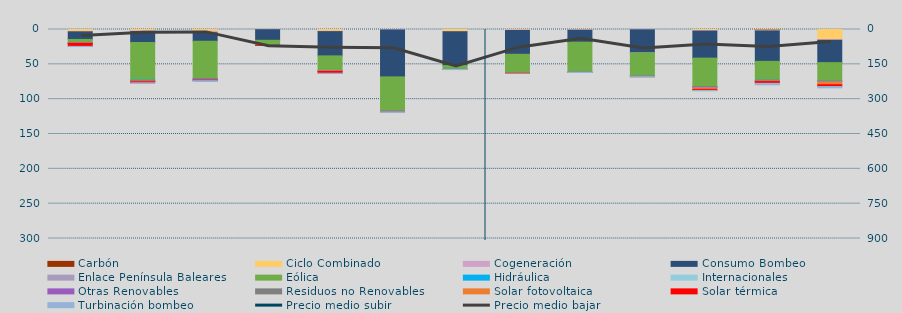
| Category | Carbón | Ciclo Combinado | Cogeneración | Consumo Bombeo | Enlace Península Baleares | Eólica | Hidráulica | Internacionales | Otras Renovables | Residuos no Renovables | Solar fotovoltaica | Solar térmica | Turbinación bombeo |
|---|---|---|---|---|---|---|---|---|---|---|---|---|---|
| 0 | 0 | 2750.7 | 621.4 | 10873.4 | 0 | 4830.6 | 121.8 | 0 | 347.3 | 15 | 417.8 | 4272.2 | 206 |
| 1 | 0 | 1918.5 | 1097.9 | 15644.8 | 0 | 53940 | 707.2 | 0 | 770.3 | 169.1 | 860.9 | 1341.3 | 386.7 |
| 2 | 0 | 2609.1 | 2181.9 | 11984 | 0 | 53740.1 | 489.7 | 0 | 1338.8 | 61.2 | 254.1 | 740.7 | 1229 |
| 3 | 0 | 263.3 | 58 | 15135.8 | 0 | 6986.8 | 204.2 | 0 | 0 | 0 | 19.1 | 10 | 0 |
| 4 | 0 | 2541.1 | 504.6 | 34828.6 | 0 | 20974.2 | 56.9 | 0 | 659.6 | 0 | 686.2 | 2480.3 | 253.2 |
| 5 | 0 | 0 | 686.4 | 67342.6 | 0 | 49071.7 | 271.7 | 0 | 794.5 | 0 | 557.9 | 0 | 259.9 |
| 6 | 0 | 3064.1 | 163.7 | 48534.4 | 0 | 5474.1 | 38.8 | 0 | 117.5 | 0 | 22.5 | 0 | 130 |
| 7 | 0 | 754.5 | 626.3 | 34195.3 | 0 | 26304.6 | 431 | 0 | 574.8 | 3.9 | 78.7 | 0 | 0 |
| 8 | 0 | 527.6 | 537.7 | 17096.8 | 0 | 43158.6 | 57.1 | 0 | 178.1 | 0 | 29.6 | 0 | 157.5 |
| 9 | 0 | 33.9 | 492.3 | 32860 | 204 | 33430.9 | 70.8 | 0 | 339.4 | 109.7 | 324.3 | 0 | 570.1 |
| 10 | 0 | 1823.5 | 445.3 | 38830 | 0 | 40976.3 | 479.9 | 0 | 886 | 0.2 | 2434.6 | 1489.3 | 549.6 |
| 11 | 543 | 1288.6 | 238.655 | 43678.268 | 0 | 27098.515 | 150.455 | 0 | 982.208 | 13.2 | 761.432 | 2474.8 | 2164.5 |
| 12 | 0 | 14634.199 | 838.098 | 32075.867 | 0 | 26340.743 | 533.073 | 0 | 507.085 | 0 | 4421.722 | 2509.099 | 1924.625 |